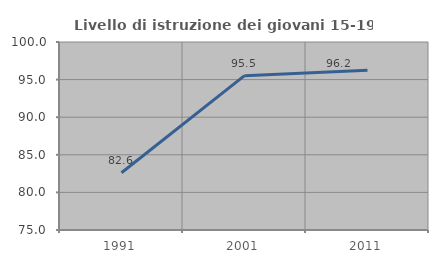
| Category | Livello di istruzione dei giovani 15-19 anni |
|---|---|
| 1991.0 | 82.617 |
| 2001.0 | 95.522 |
| 2011.0 | 96.247 |